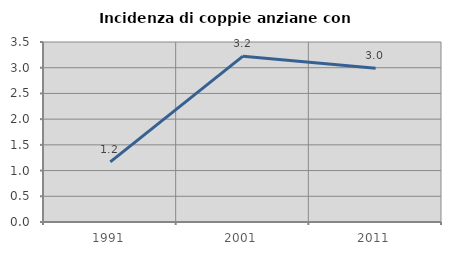
| Category | Incidenza di coppie anziane con figli |
|---|---|
| 1991.0 | 1.17 |
| 2001.0 | 3.224 |
| 2011.0 | 2.988 |